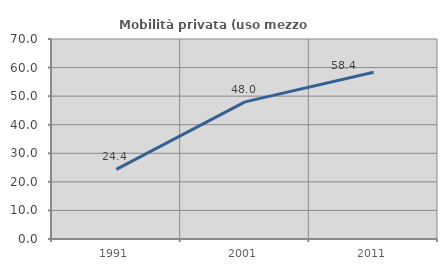
| Category | Mobilità privata (uso mezzo privato) |
|---|---|
| 1991.0 | 24.39 |
| 2001.0 | 47.985 |
| 2011.0 | 58.367 |